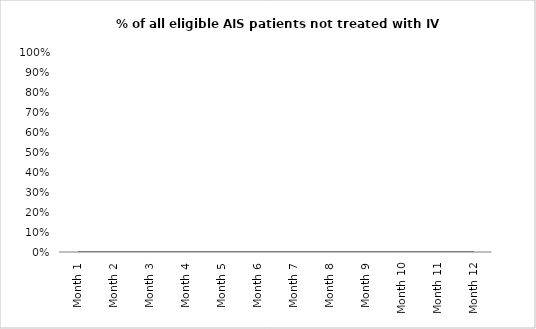
| Category | % of all eligible AIS patients not treated with IV Activase |
|---|---|
| Month 1 | 0 |
| Month 2 | 0 |
| Month 3 | 0 |
| Month 4 | 0 |
| Month 5 | 0 |
| Month 6 | 0 |
| Month 7 | 0 |
| Month 8 | 0 |
| Month 9 | 0 |
| Month 10 | 0 |
| Month 11 | 0 |
| Month 12 | 0 |